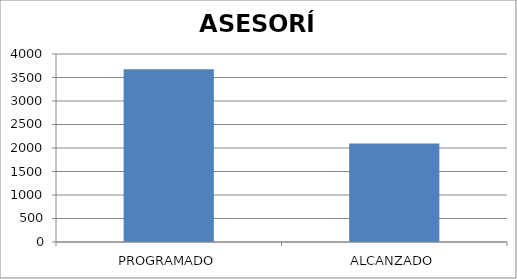
| Category | ASESORÍA |
|---|---|
| PROGRAMADO | 3675 |
| ALCANZADO | 2096 |